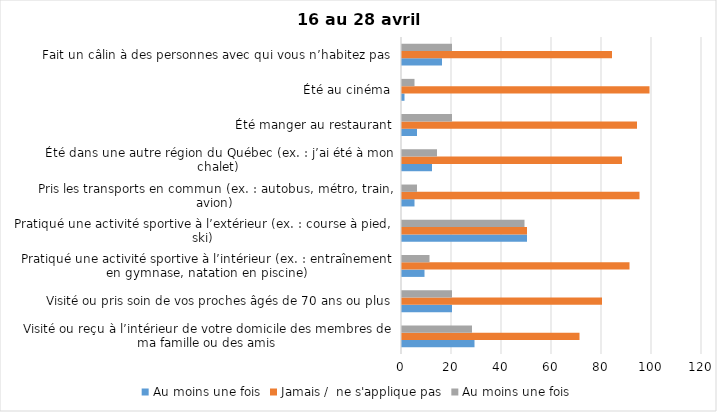
| Category | Au moins une fois | Jamais /  ne s'applique pas |
|---|---|---|
| Visité ou reçu à l’intérieur de votre domicile des membres de ma famille ou des amis | 28 | 71 |
| Visité ou pris soin de vos proches âgés de 70 ans ou plus | 20 | 80 |
| Pratiqué une activité sportive à l’intérieur (ex. : entraînement en gymnase, natation en piscine) | 11 | 91 |
| Pratiqué une activité sportive à l’extérieur (ex. : course à pied, ski) | 49 | 50 |
| Pris les transports en commun (ex. : autobus, métro, train, avion) | 6 | 95 |
| Été dans une autre région du Québec (ex. : j’ai été à mon chalet) | 14 | 88 |
| Été manger au restaurant | 20 | 94 |
| Été au cinéma | 5 | 99 |
| Fait un câlin à des personnes avec qui vous n’habitez pas | 20 | 84 |